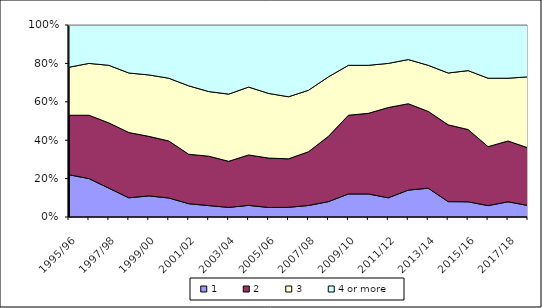
| Category | Number of bedrooms | 1 | 2 | 3 | 4 or more |
|---|---|---|---|---|---|
| 1995/96 |  | 22 | 31 | 25 | 22 |
| 1996/97 |  | 20 | 33 | 27 | 20 |
| 1997/98 |  | 15 | 34 | 30 | 21 |
| 1998/99 |  | 10 | 34 | 31 | 25 |
| 1999/00 |  | 11 | 31 | 32 | 26 |
| 2000/01 |  | 10 | 30 | 33 | 28 |
| 2001/02 |  | 7 | 26 | 36 | 32 |
| 2002/03 |  | 6 | 26 | 34 | 35 |
| 2003/04 |  | 5 | 24 | 35 | 36 |
| 2004/05 |  | 6 | 26 | 35 | 32 |
| 2005/06 |  | 5 | 26 | 34 | 36 |
| 2006/07 |  | 5 | 25 | 32 | 37 |
| 2007/08 |  | 6 | 28 | 32 | 34 |
| 2008/09 |  | 8 | 34 | 31 | 27 |
| 2009/10 |  | 12 | 41 | 26 | 21 |
| 2010/11 |  | 12 | 42 | 25 | 21 |
| 2011/12 |  | 10 | 47 | 23 | 20 |
| 2012/13 |  | 14 | 45 | 23 | 18 |
| 2013/14 |  | 15 | 40 | 24 | 21 |
| 2014/15 |  | 8 | 40 | 27 | 25 |
| 2015/16 |  | 8 | 38 | 31 | 24 |
| 2016/17 |  | 6 | 31 | 36 | 28 |
| 2017/18 |  | 8 | 32 | 33 | 28 |